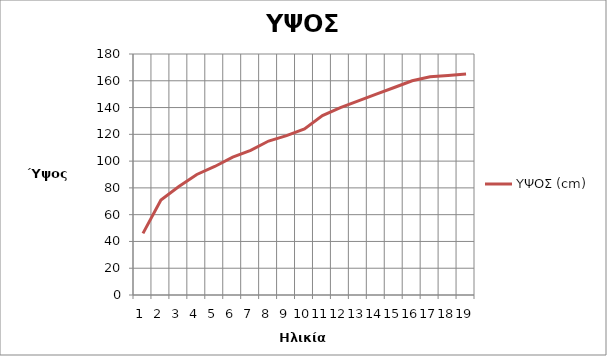
| Category | ΥΨΟΣ (cm) |
|---|---|
| 0 | 46 |
| 1 | 71 |
| 2 | 81 |
| 3 | 90 |
| 4 | 96 |
| 5 | 103 |
| 6 | 108 |
| 7 | 115 |
| 8 | 119 |
| 9 | 124 |
| 10 | 134 |
| 11 | 140 |
| 12 | 145 |
| 13 | 150 |
| 14 | 155 |
| 15 | 160 |
| 16 | 163 |
| 17 | 164 |
| 18 | 165 |